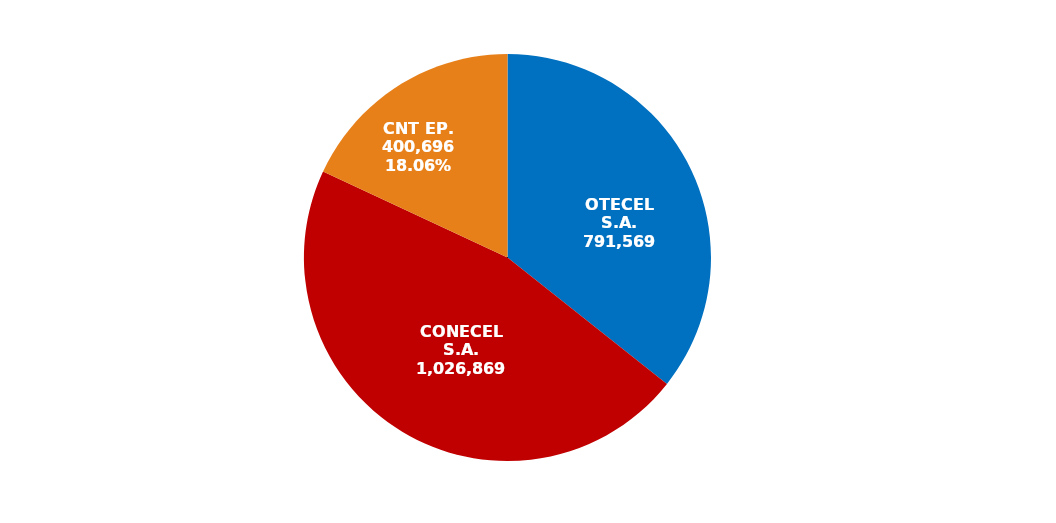
| Category | Series 0 |
|---|---|
| OTECEL S.A. | 791569 |
| CONECEL S.A. | 1026869 |
| CNT EP. | 400696 |